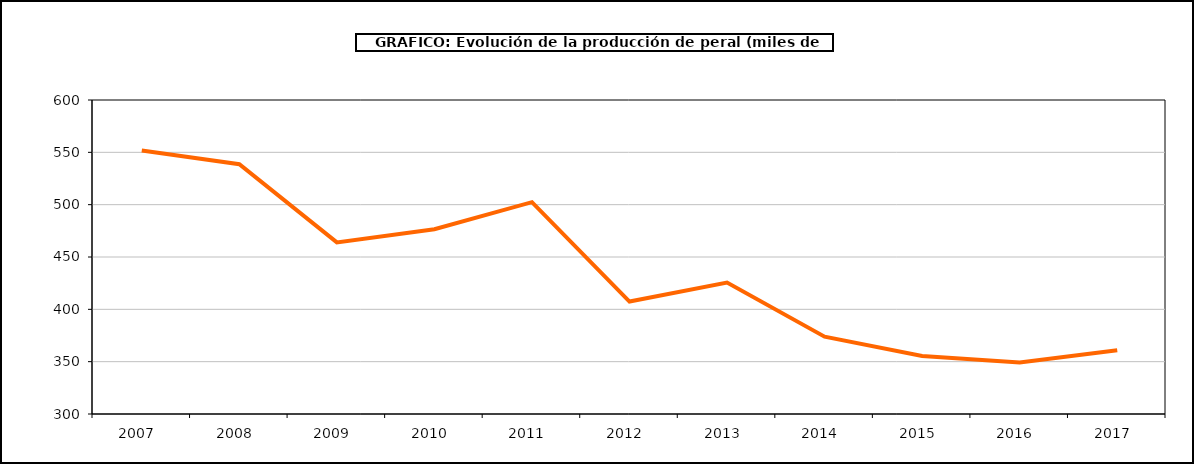
| Category | producción peral |
|---|---|
| 2007.0 | 551.848 |
| 2008.0 | 538.675 |
| 2009.0 | 463.969 |
| 2010.0 | 476.586 |
| 2011.0 | 502.434 |
| 2012.0 | 407.428 |
| 2013.0 | 425.56 |
| 2014.0 | 373.865 |
| 2015.0 | 355.41 |
| 2016.0 | 349.247 |
| 2017.0 | 360.957 |